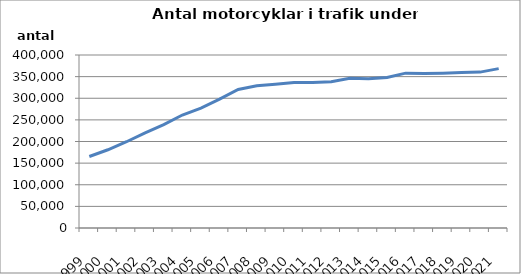
| Category | Series 0 |
|---|---|
| 1999.0 | 165310 |
| 2000.0 | 180915 |
| 2001.0 | 199451 |
| 2002.0 | 220079 |
| 2003.0 | 238981 |
| 2004.0 | 261214 |
| 2005.0 | 277039 |
| 2006.0 | 297983 |
| 2007.0 | 320392 |
| 2008.0 | 329084 |
| 2009.0 | 332561 |
| 2010.0 | 336197 |
| 2011.0 | 336439 |
| 2012.0 | 338339 |
| 2013.0 | 346314 |
| 2014.0 | 344988 |
| 2015.0 | 347906 |
| 2016.0 | 358019 |
| 2017.0 | 357231 |
| 2018.0 | 358024 |
| 2019.0 | 359380 |
| 2020.0 | 360422 |
| 2021.0 | 368485 |